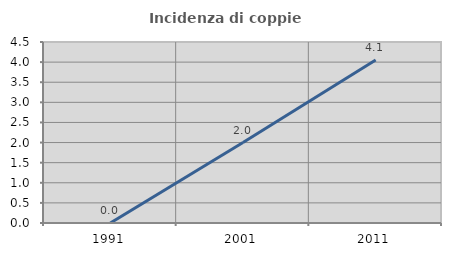
| Category | Incidenza di coppie miste |
|---|---|
| 1991.0 | 0 |
| 2001.0 | 2 |
| 2011.0 | 4.051 |